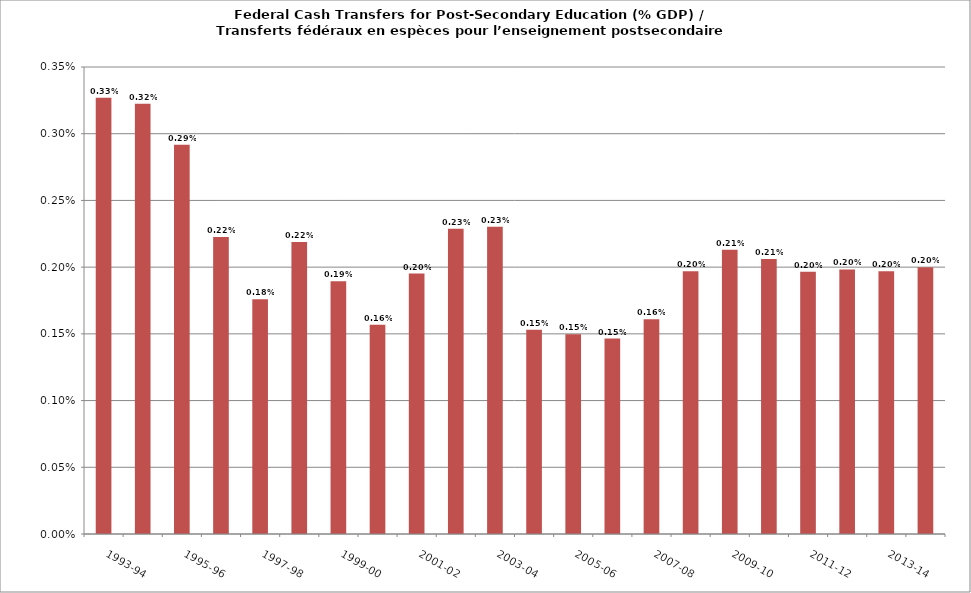
| Category | Series 0 |
|---|---|
| 1993-94 | 0.003 |
| 1994-95 | 0.003 |
| 1995-96 | 0.003 |
| 1996-97 | 0.002 |
| 1997-98 | 0.002 |
| 1998-99 | 0.002 |
| 1999-00 | 0.002 |
| 2000-01 | 0.002 |
| 2001-02 | 0.002 |
| 2002-03 | 0.002 |
| 2003-04 | 0.002 |
| 2004-05 | 0.002 |
| 2005-06 | 0.001 |
| 2006-07 | 0.001 |
| 2007-08 | 0.002 |
| 2008-09 | 0.002 |
| 2009-10 | 0.002 |
| 2010-11 | 0.002 |
| 2011-12 | 0.002 |
| 2012-13 | 0.002 |
| 2013-14 | 0.002 |
| 2014-15 | 0.002 |